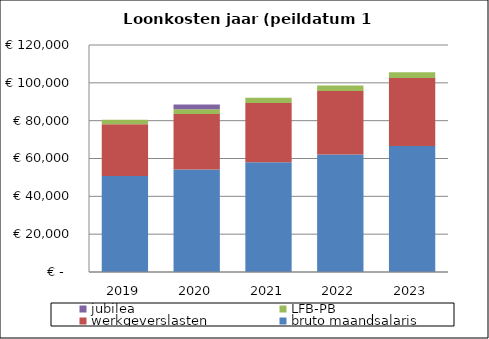
| Category | bruto maandsalaris | werkgeverslasten | LFB-PB | jubilea |
|---|---|---|---|---|
| 2019.0 | 50748 | 27403.92 | 2355.392 | 0 |
| 2020.0 | 54240 | 29289.6 | 2517.468 | 2440.8 |
| 2021.0 | 58044 | 31343.76 | 2694.025 | 0 |
| 2022.0 | 62136 | 33553.44 | 2883.949 | 0 |
| 2023.0 | 66552 | 35938.08 | 3088.911 | 0 |